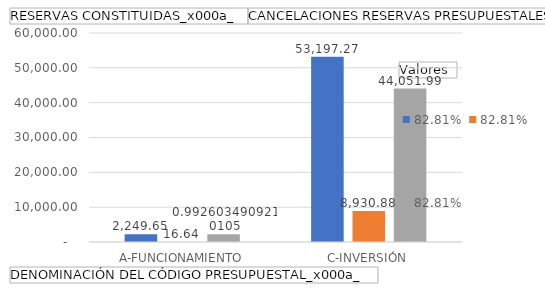
| Category | RESERVAS CONSTITUIDAS
 | CANCELACIONES RESERVAS PRESUPUESTALES
  | PAGOS
ACUMULADOS
 |
|---|---|---|---|
| A-FUNCIONAMIENTO | 2249.649 | 16.64 | 2233.009 |
| C-INVERSIÓN | 53197.266 | 8930.885 | 44051.99 |